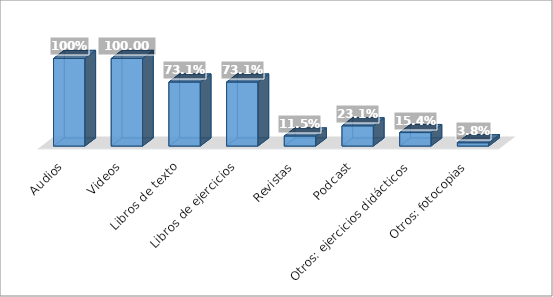
| Category | Series 0 |
|---|---|
| Audios | 1 |
| Videos | 1 |
| Libros de texto | 0.731 |
| Libros de ejercicios | 0.731 |
| Revistas | 0.115 |
| Podcast | 0.231 |
| Otros: ejercicios didácticos | 0.154 |
| Otros: fotocopias | 0.038 |